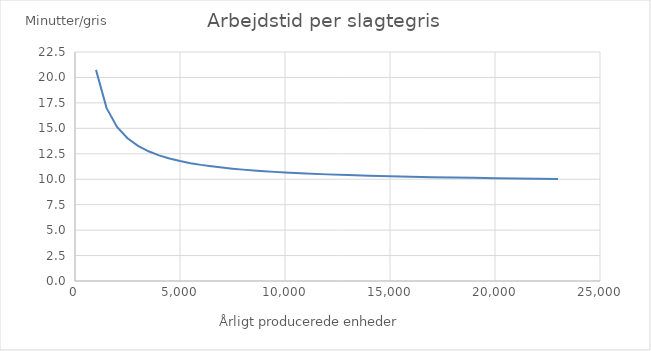
| Category | Producerede slagtesvin/år Slagtevægt |
|---|---|
| 1000.0 | 20.743 |
| 1500.0 | 17.01 |
| 2000.0 | 15.143 |
| 2500.0 | 14.023 |
| 3000.0 | 13.276 |
| 3500.0 | 12.743 |
| 4000.0 | 12.343 |
| 4500.0 | 12.032 |
| 5000.0 | 11.783 |
| 5500.0 | 11.579 |
| 6000.0 | 11.41 |
| 6500.0 | 11.266 |
| 7000.0 | 11.143 |
| 7500.0 | 11.036 |
| 8000.0 | 10.943 |
| 8500.0 | 10.861 |
| 9000.0 | 10.787 |
| 9500.0 | 10.722 |
| 10000.0 | 10.663 |
| 11000.0 | 10.561 |
| 12000.0 | 10.476 |
| 13000.0 | 10.404 |
| 14000.0 | 10.343 |
| 15000.0 | 10.29 |
| 16000.0 | 10.243 |
| 17000.0 | 10.202 |
| 18000.0 | 10.165 |
| 19000.0 | 10.132 |
| 20000.0 | 10.103 |
| 21000.0 | 10.076 |
| 22000.0 | 10.052 |
| 23000.0 | 10.03 |